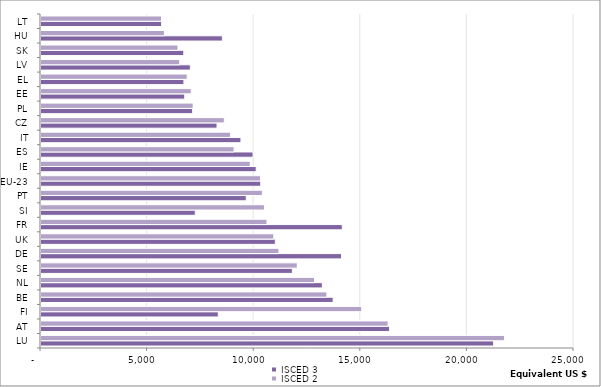
| Category | ISCED 3 | ISCED 2 |
|---|---|---|
| LU | 21231.088 | 21738.627 |
| AT | 16350.742 | 16282.216 |
| FI | 8315.414 | 15040.937 |
| BE | 13703.645 | 13408.934 |
| NL | 13195.608 | 12830.594 |
| SE | 11790.169 | 12020.346 |
| DE | 14094.101 | 11158.854 |
| UK | 10991.806 | 10920.955 |
| FR | 14131.665 | 10598.937 |
| SI | 7236.38 | 10480.577 |
| PT | 9628.003 | 10381.651 |
| EU-23 | 10307.836 | 10301.582 |
| IE | 10094.136 | 9814.443 |
| ES | 9946.108 | 9056.448 |
| IT | 9377.358 | 8892.885 |
| CZ | 8256.739 | 8597.877 |
| PL | 7114.07 | 7136.217 |
| EE | 6742.462 | 7047.452 |
| EL | 6703.912 | 6858.597 |
| LV | 7005.765 | 6504.295 |
| SK | 6697.651 | 6425.637 |
| HU | 8508.121 | 5787.788 |
| LT | 5657.451 | 5650.546 |